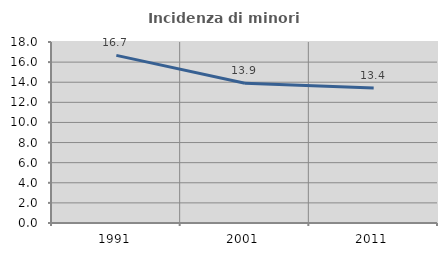
| Category | Incidenza di minori stranieri |
|---|---|
| 1991.0 | 16.667 |
| 2001.0 | 13.889 |
| 2011.0 | 13.415 |